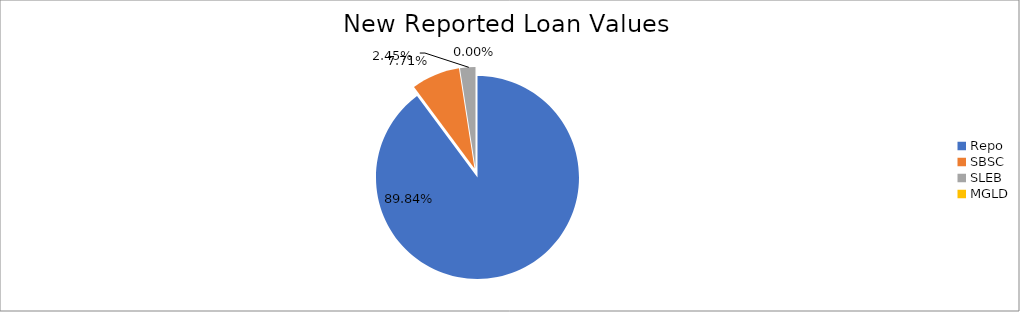
| Category | Series 0 |
|---|---|
| Repo | 10789356.01 |
| SBSC | 926018.073 |
| SLEB | 293784.573 |
| MGLD | 161.65 |